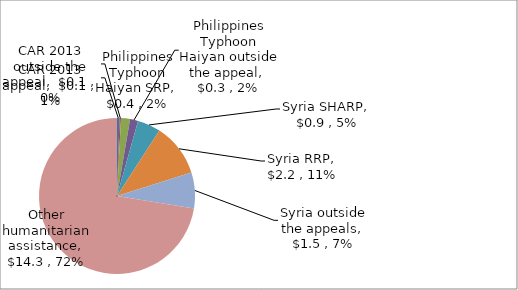
| Category | US$ billions |
|---|---|
| CAR 2013 appeal | 0.103 |
| CAR 2013 outside the appeal | 0.059 |
| Philippines Typhoon Haiyan SRP | 0.369 |
| Philippines Typhoon Haiyan outside the appeal | 0.327 |
| Syria SHARP | 0.948 |
| Syria RRP | 2.171 |
| Syria outside the appeals | 1.467 |
| Other humanitarian assistance | 14.293 |